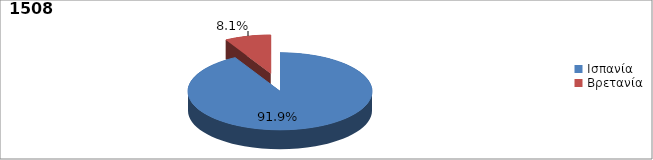
| Category | Series 0 |
|---|---|
| Ισπανία | 0.919 |
| Βρετανία | 0.081 |